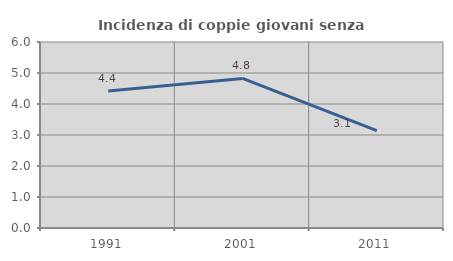
| Category | Incidenza di coppie giovani senza figli |
|---|---|
| 1991.0 | 4.423 |
| 2001.0 | 4.826 |
| 2011.0 | 3.143 |